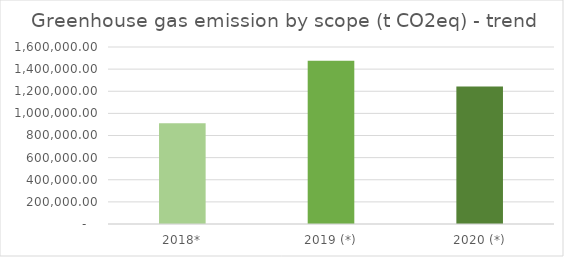
| Category | Series 0 |
|---|---|
| 2018* | 910878 |
| 2019 (*) | 1475731 |
| 2020 (*) | 1243966 |